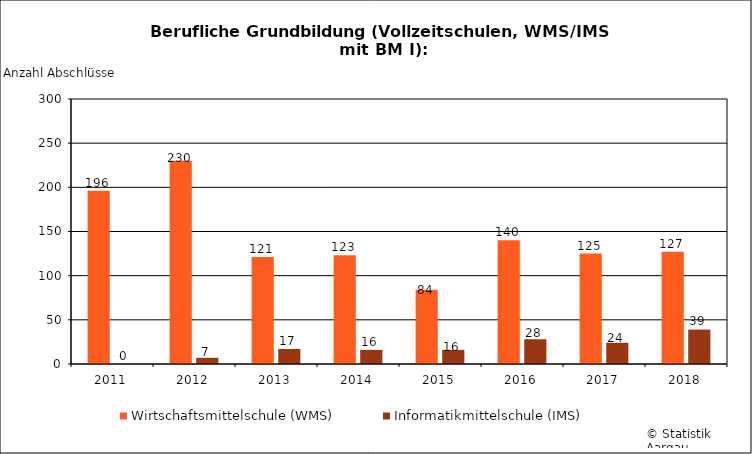
| Category | Wirtschaftsmittelschule (WMS) | Informatikmittelschule (IMS) |
|---|---|---|
| 2011 | 196 | 0 |
| 2012 | 230 | 7 |
| 2013 | 121 | 17 |
| 2014 | 123 | 16 |
| 2015 | 84 | 16 |
| 2016 | 140 | 28 |
| 2017 | 125 | 24 |
| 2018 | 127 | 39 |